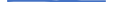
| Category | Series 0 |
|---|---|
| 0 | 19 |
| 1 | 31 |
| 2 | 25 |
| 3 | 24 |
| 4 | 17 |
| 5 | 27 |
| 6 | 16 |
| 7 | 17 |
| 8 | 13 |